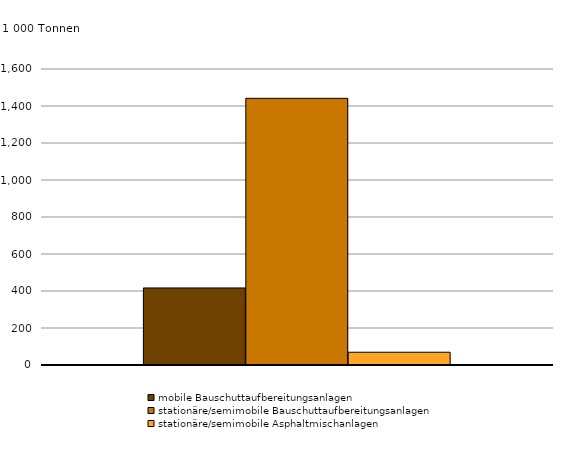
| Category | mobile Bauschuttaufbereitungsanlagen | stationäre/semimobile Bauschuttaufbereitungsanlagen | stationäre/semimobile Asphaltmischanlagen |
|---|---|---|---|
|  | 416513 | 1441508 | 68985 |